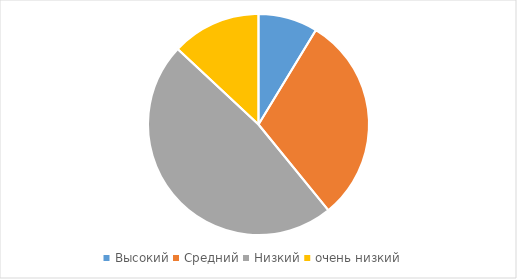
| Category | Series 0 |
|---|---|
| Высокий | 2 |
| Средний | 7 |
| Низкий | 11 |
| очень низкий | 3 |